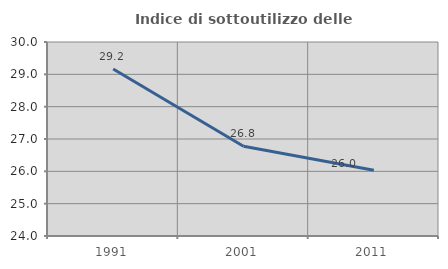
| Category | Indice di sottoutilizzo delle abitazioni  |
|---|---|
| 1991.0 | 29.167 |
| 2001.0 | 26.777 |
| 2011.0 | 26.036 |